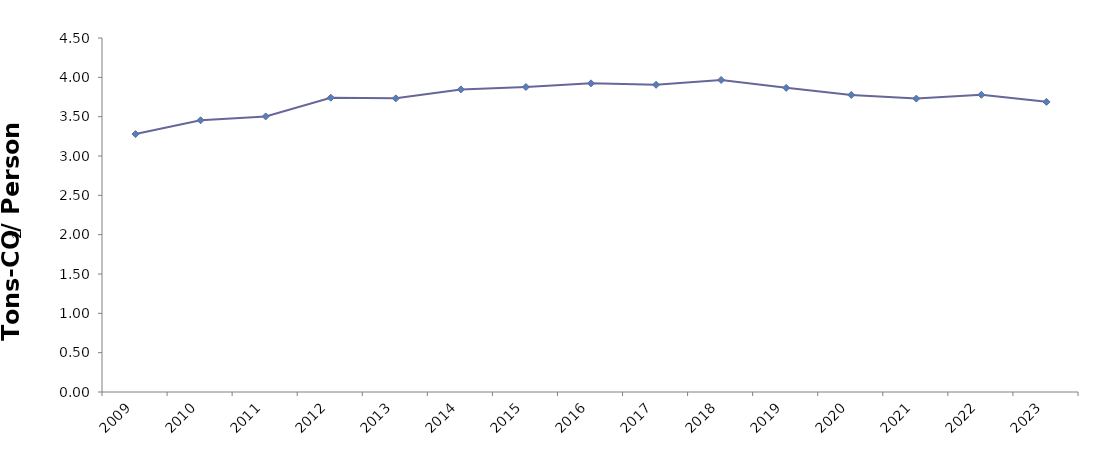
| Category | CO2/POP
(Ton-CO2/Person) |
|---|---|
| 2009 | 3.279 |
| 2010 | 3.454 |
| 2011 | 3.503 |
| 2012 | 3.741 |
| 2013 | 3.733 |
| 2014 | 3.846 |
| 2015 | 3.877 |
| 2016 | 3.924 |
| 2017 | 3.905 |
| 2018 | 3.967 |
| 2019 | 3.866 |
| 2020 | 3.776 |
| 2021 | 3.73 |
| 2022 | 3.778 |
| 2023 | 3.689 |